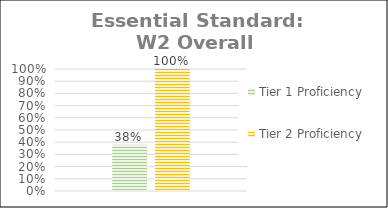
| Category | Tier 1 Proficiency | Tier 2 Proficiency |
|---|---|---|
| 0 | 0.38 | 1 |